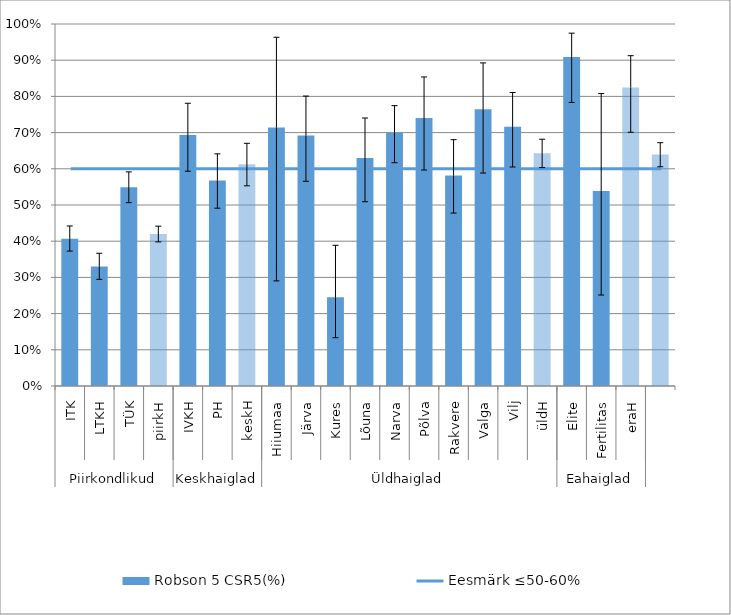
| Category | Robson 5 CSR5(%) |
|---|---|
| 0 | 0.407 |
| 1 | 0.33 |
| 2 | 0.549 |
| 3 | 0.42 |
| 4 | 0.693 |
| 5 | 0.567 |
| 6 | 0.613 |
| 7 | 0.714 |
| 8 | 0.692 |
| 9 | 0.245 |
| 10 | 0.63 |
| 11 | 0.7 |
| 12 | 0.74 |
| 13 | 0.582 |
| 14 | 0.765 |
| 15 | 0.716 |
| 16 | 0.643 |
| 17 | 0.909 |
| 18 | 0.538 |
| 19 | 0.825 |
| 20 | 0.639 |